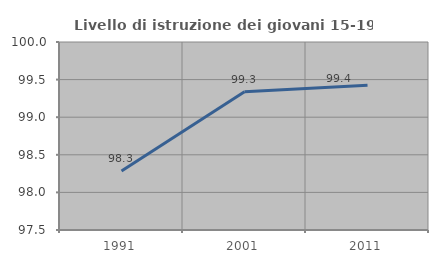
| Category | Livello di istruzione dei giovani 15-19 anni |
|---|---|
| 1991.0 | 98.283 |
| 2001.0 | 99.338 |
| 2011.0 | 99.425 |